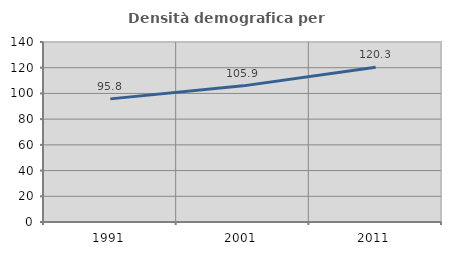
| Category | Densità demografica |
|---|---|
| 1991.0 | 95.764 |
| 2001.0 | 105.885 |
| 2011.0 | 120.326 |